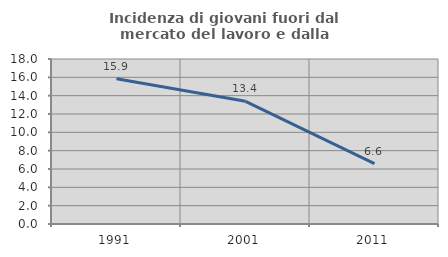
| Category | Incidenza di giovani fuori dal mercato del lavoro e dalla formazione  |
|---|---|
| 1991.0 | 15.854 |
| 2001.0 | 13.386 |
| 2011.0 | 6.579 |